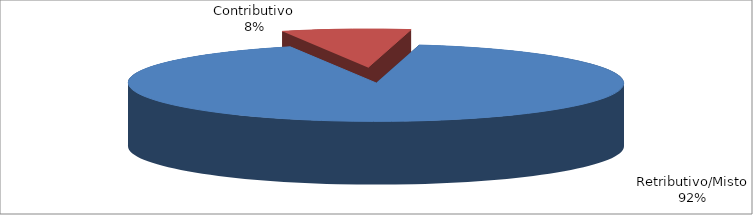
| Category | Decorrenti gennaio - settembre 2021 |
|---|---|
| Retributivo/Misto | 238805 |
| Contributivo | 21901 |